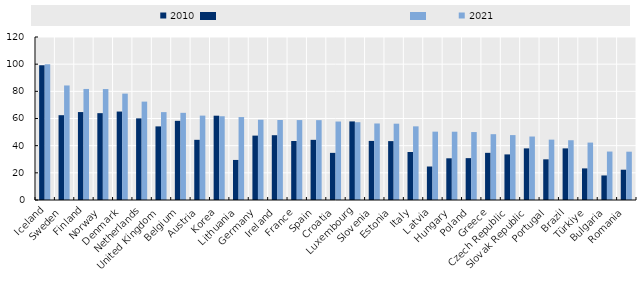
| Category | 2010 | 2021 |
|---|---|---|
| Iceland | 99.122 | 100 |
| Sweden | 62.435 | 84.318 |
| Finland | 64.74 | 81.748 |
| Norway | 63.931 | 81.683 |
| Denmark | 65.12 | 78.31 |
| Netherlands | 60.1 | 72.429 |
| United Kingdom | 54.195 | 64.703 |
| Belgium | 58.286 | 64.174 |
| Austria | 44.309 | 62.124 |
| Korea | 62.065 | 61.663 |
| Lithuania | 29.489 | 61.063 |
| Germany | 47.398 | 59.081 |
| Ireland | 47.698 | 58.885 |
| France | 43.425 | 58.842 |
| Spain | 44.292 | 58.788 |
| Croatia | 34.702 | 57.768 |
| Luxembourg | 57.848 | 57.264 |
| Slovenia | 43.504 | 56.336 |
| Estonia | 43.353 | 56.178 |
| Italy | 35.345 | 54.226 |
| Latvia | 24.657 | 50.316 |
| Hungary | 30.699 | 50.273 |
| Poland | 30.823 | 50.023 |
| Greece | 34.723 | 48.449 |
| Czech Republic | 33.564 | 47.786 |
| Slovak Republic | 38.004 | 46.73 |
| Portugal | 29.942 | 44.438 |
| Brazil | 38 | 44 |
| Türkiye | 23.266 | 42.27 |
| Bulgaria | 18.066 | 35.669 |
| Romania | 22.297 | 35.563 |